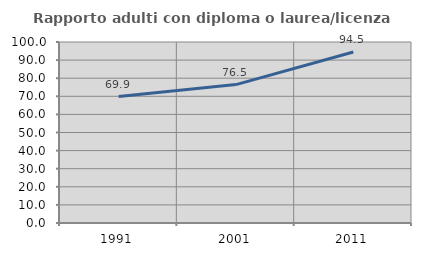
| Category | Rapporto adulti con diploma o laurea/licenza media  |
|---|---|
| 1991.0 | 69.88 |
| 2001.0 | 76.471 |
| 2011.0 | 94.495 |